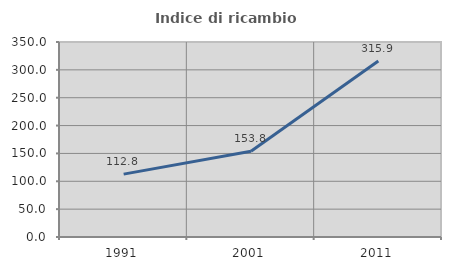
| Category | Indice di ricambio occupazionale  |
|---|---|
| 1991.0 | 112.821 |
| 2001.0 | 153.846 |
| 2011.0 | 315.873 |